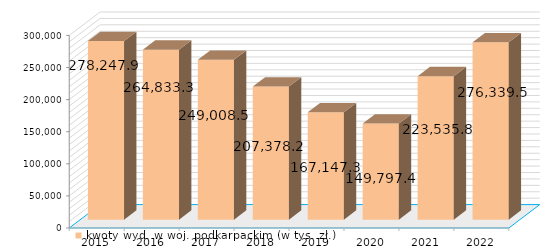
| Category | kwoty wyd. w woj. podkarpackim (w tys. zł.) |
|---|---|
| 2015.0 | 278247.9 |
| 2016.0 | 264833.3 |
| 2017.0 | 249008.5 |
| 2018.0 | 207378.2 |
| 2019.0 | 167147.3 |
| 2020.0 | 149797.4 |
| 2021.0 | 223535.811 |
| 2022.0 | 276339.488 |